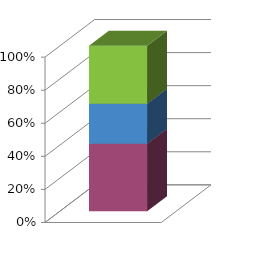
| Category | Series 2 | Series 1 | Series 0 |
|---|---|---|---|
| 0 | 40820 | 24180 | 35000 |